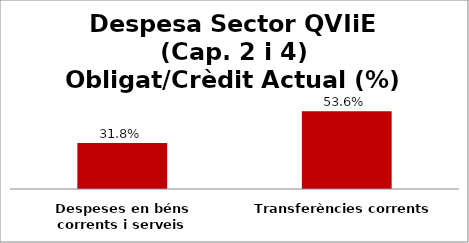
| Category | Series 0 |
|---|---|
| Despeses en béns corrents i serveis | 0.318 |
| Transferències corrents | 0.536 |